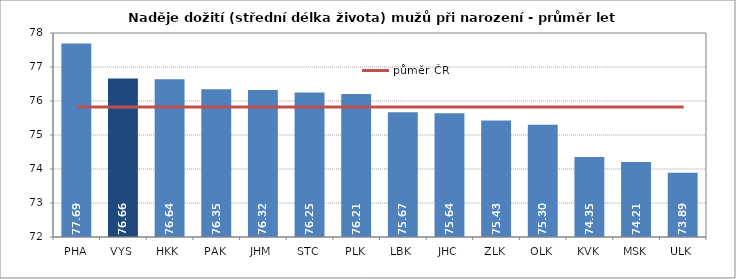
| Category | Series 0 |
|---|---|
| PHA | 77.695 |
| VYS | 76.664 |
| HKK | 76.636 |
| PAK | 76.348 |
| JHM | 76.323 |
| STC | 76.249 |
| PLK | 76.208 |
| LBK | 75.668 |
| JHC | 75.638 |
| ZLK | 75.43 |
| OLK | 75.304 |
| KVK | 74.353 |
| MSK | 74.205 |
| ULK | 73.893 |